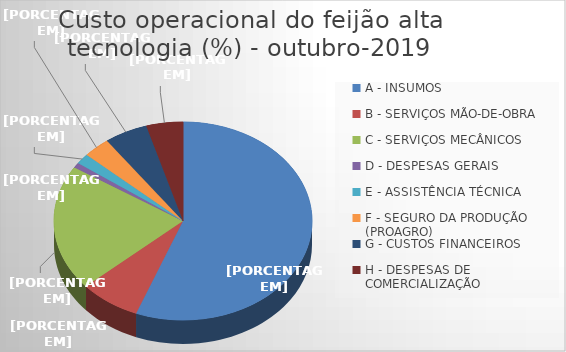
| Category | Series 0 |
|---|---|
| A - INSUMOS | 55.906 |
| B - SERVIÇOS MÃO-DE-OBRA | 7.627 |
| C - SERVIÇOS MECÂNICOS | 20.532 |
| D - DESPESAS GERAIS  | 0.841 |
| E - ASSISTÊNCIA TÉCNICA | 1.698 |
| F - SEGURO DA PRODUÇÃO (PROAGRO) | 3.396 |
| G - CUSTOS FINANCEIROS | 5.4 |
| H - DESPESAS DE COMERCIALIZAÇÃO | 4.6 |